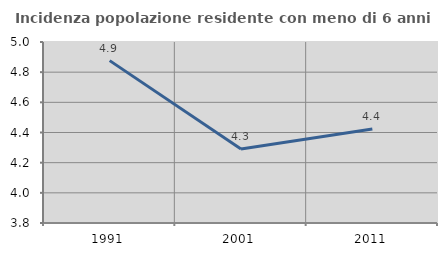
| Category | Incidenza popolazione residente con meno di 6 anni |
|---|---|
| 1991.0 | 4.877 |
| 2001.0 | 4.291 |
| 2011.0 | 4.423 |